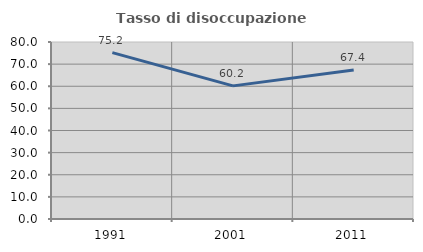
| Category | Tasso di disoccupazione giovanile  |
|---|---|
| 1991.0 | 75.181 |
| 2001.0 | 60.167 |
| 2011.0 | 67.353 |